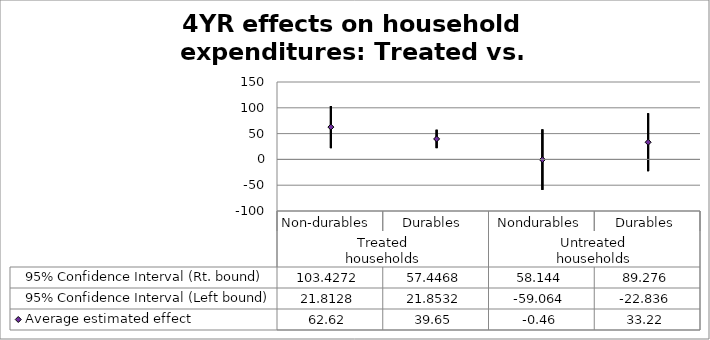
| Category | 95% Confidence Interval (Rt. bound) | 95% Confidence Interval (Left bound) | Average estimated effect |
|---|---|---|---|
| 0 | 103.427 | 21.813 | 62.62 |
| 1 | 57.447 | 21.853 | 39.65 |
| 2 | 58.144 | -59.064 | -0.46 |
| 3 | 89.276 | -22.836 | 33.22 |